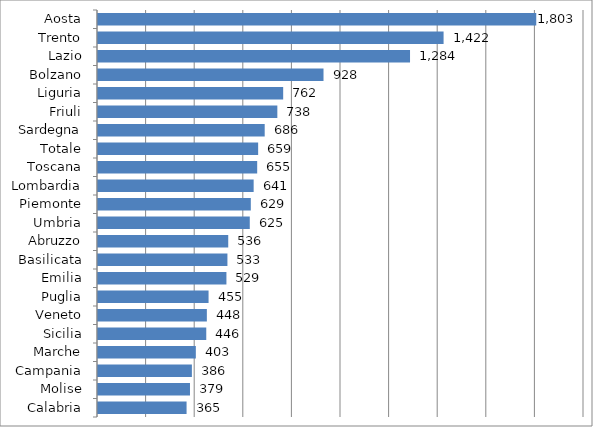
| Category | Series 0 |
|---|---|
| Aosta | 1803.488 |
| Trento | 1422.151 |
| Lazio | 1284.07 |
| Bolzano | 928.035 |
| Liguria | 762.047 |
| Friuli | 738.029 |
| Sardegna | 686.013 |
| Totale | 659.046 |
| Toscana | 655.087 |
| Lombardia | 640.551 |
| Piemonte | 628.871 |
| Umbria | 624.627 |
| Abruzzo | 535.947 |
| Basilicata | 532.605 |
| Emilia | 528.505 |
| Puglia | 455.015 |
| Veneto | 447.98 |
| Sicilia | 445.552 |
| Marche | 402.609 |
| Campania | 386.358 |
| Molise | 378.547 |
| Calabria | 364.515 |